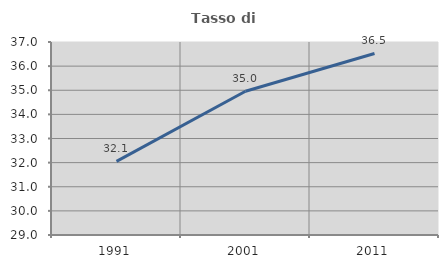
| Category | Tasso di occupazione   |
|---|---|
| 1991.0 | 32.054 |
| 2001.0 | 34.956 |
| 2011.0 | 36.526 |